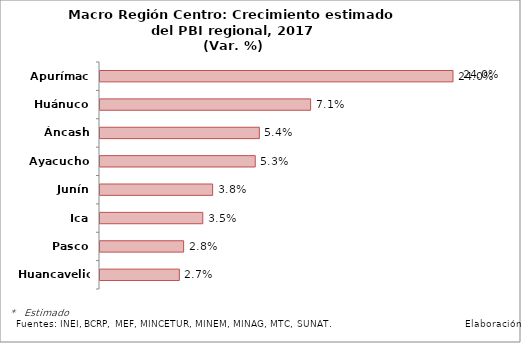
| Category | Var. %  |
|---|---|
| Apurímac | 0.24 |
| Huánuco | 0.071 |
| Áncash | 0.054 |
| Ayacucho | 0.053 |
| Junín | 0.038 |
| Ica | 0.035 |
| Pasco | 0.028 |
| Huancavelica | 0.027 |